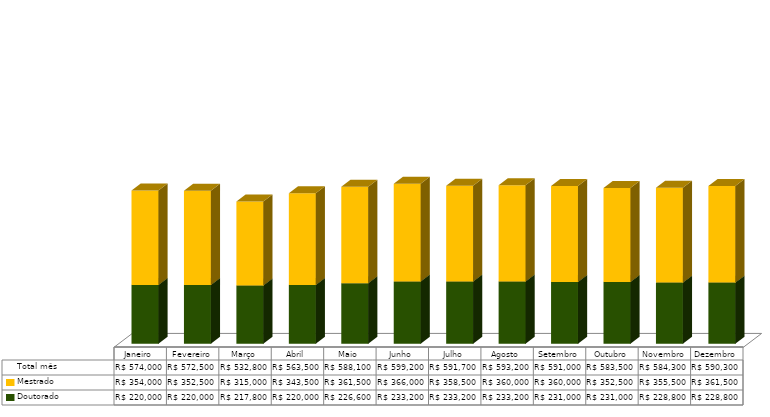
| Category | Doutorado                      | Mestrado                       | Total mês |
|---|---|---|---|
| Janeiro | 220000 | 354000 | 574000 |
| Fevereiro | 220000 | 352500 | 572500 |
| Março | 217800 | 315000 | 532800 |
| Abril | 220000 | 343500 | 563500 |
| Maio | 226600 | 361500 | 588100 |
| Junho | 233200 | 366000 | 599200 |
| Julho | 233200 | 358500 | 591700 |
| Agosto | 233200 | 360000 | 593200 |
| Setembro | 231000 | 360000 | 591000 |
| Outubro | 231000 | 352500 | 583500 |
| Novembro | 228800 | 355500 | 584300 |
| Dezembro | 228800 | 361500 | 590300 |